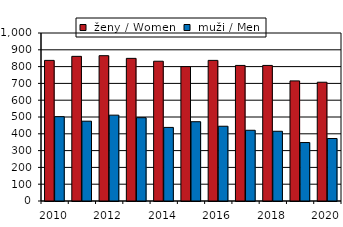
| Category |  ženy / Women  |  muži / Men |
|---|---|---|
| 2010.0 | 837 | 502 |
| 2011.0 | 861 | 475 |
| 2012.0 | 865 | 511 |
| 2013.0 | 849 | 496 |
| 2014.0 | 832 | 438 |
| 2015.0 | 800 | 472 |
| 2016.0 | 837 | 445 |
| 2017.0 | 807 | 421 |
| 2018.0 | 807 | 415 |
| 2019.0 | 715 | 348 |
| 2020.0 | 707 | 372 |